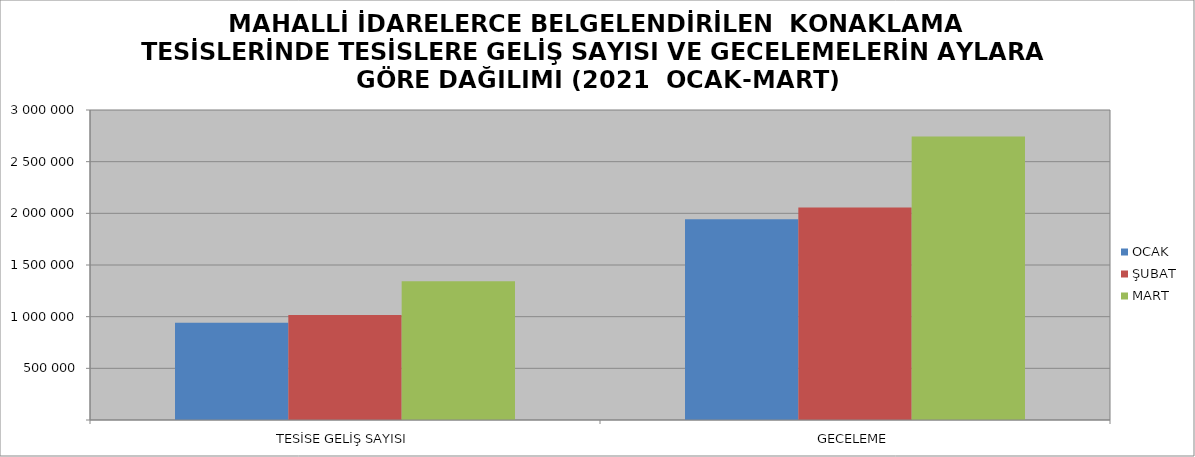
| Category | OCAK | ŞUBAT | MART |
|---|---|---|---|
| TESİSE GELİŞ SAYISI | 940331 | 1017199 | 1342202 |
| GECELEME | 1943007 | 2056594 | 2743257 |